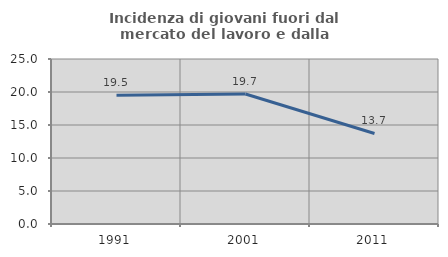
| Category | Incidenza di giovani fuori dal mercato del lavoro e dalla formazione  |
|---|---|
| 1991.0 | 19.524 |
| 2001.0 | 19.689 |
| 2011.0 | 13.714 |